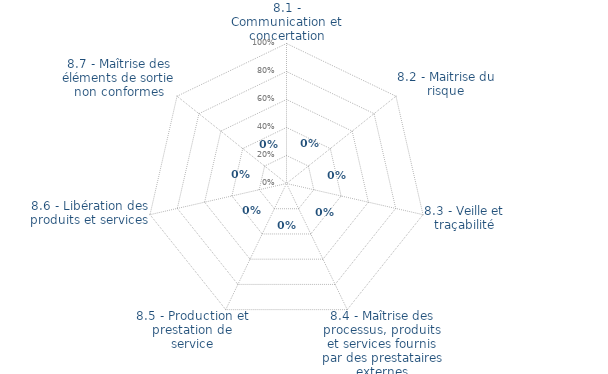
| Category | Art. 8 | limite de CONFORMITÉ |
|---|---|---|
| 8.1 - Communication et concertation | 0 | 0 |
| 8.2 - Maitrise du risque | 0 | 0 |
| 8.3 - Veille et traçabilité | 0 | 0 |
| 8.4 - Maîtrise des processus, produits et services fournis par des prestataires externes | 0 | 0 |
| 8.5 - Production et prestation de service | 0 | 0 |
| 8.6 - Libération des produits et services | 0 | 0 |
| 8.7 - Maîtrise des éléments de sortie non conformes | 0 | 0 |